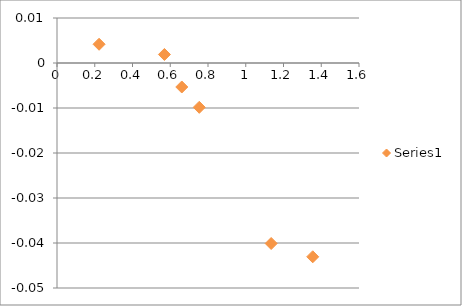
| Category | Series 0 |
|---|---|
| 1.354838709677419 | -0.043 |
| 0.222863741339492 | 0.004 |
| 1.134751773049645 | -0.04 |
| 0.569148936170213 | 0.002 |
| 0.753670473083197 | -0.01 |
| 0.661068702290076 | -0.005 |